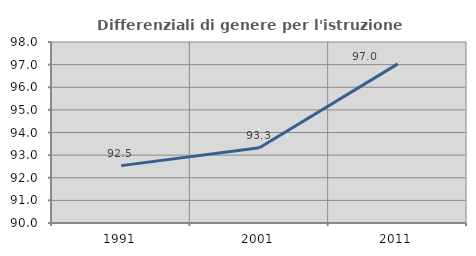
| Category | Differenziali di genere per l'istruzione superiore |
|---|---|
| 1991.0 | 92.536 |
| 2001.0 | 93.329 |
| 2011.0 | 97.033 |